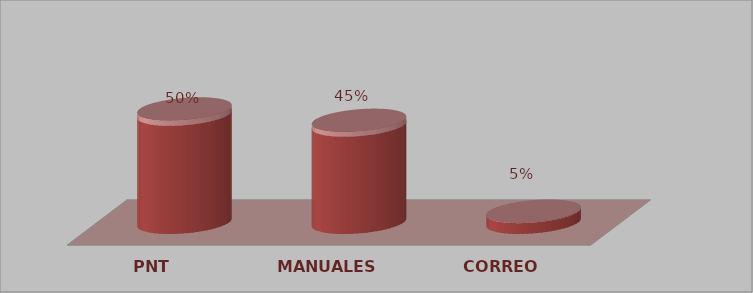
| Category | Series 0 | Series 1 |
|---|---|---|
| PNT | 10 | 0.5 |
| MANUALES | 9 | 0.45 |
| CORREO | 1 | 0.05 |